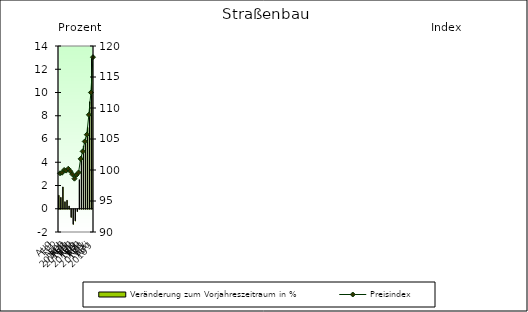
| Category | Veränderung zum Vorjahreszeitraum in % |
|---|---|
| 0 | 1.161 |
| 1 | 0.98 |
| 2 | 1.878 |
| 3 | 0.607 |
| 4 | 0.731 |
| 5 | 0.24 |
| 6 | -0.7 |
| 7 | -1.3 |
| 8 | -1 |
| 9 | -0.2 |
| 10 | 2.5 |
| 11 | 4.5 |
| 12 | 5.4 |
| 13 | 6.1 |
| 14 | 7 |
| 15 | 9.2 |
| 16 | 13 |